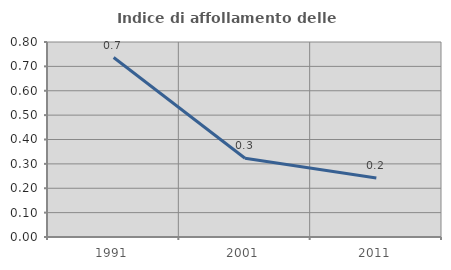
| Category | Indice di affollamento delle abitazioni  |
|---|---|
| 1991.0 | 0.736 |
| 2001.0 | 0.323 |
| 2011.0 | 0.242 |